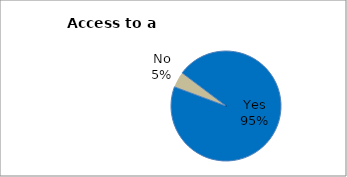
| Category | Series 0 |
|---|---|
| Yes | 95.382 |
| No | 4.618 |